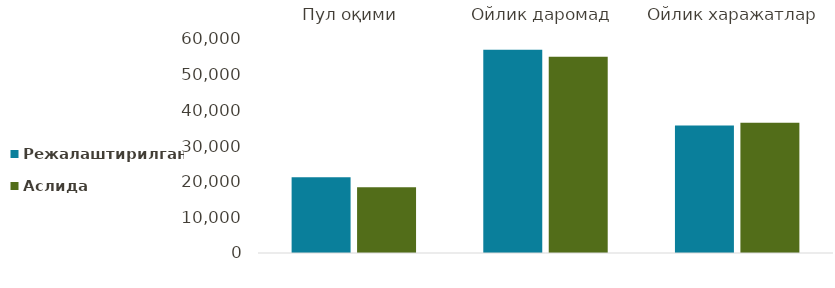
| Category | Режалаштирилган | Аслида |
|---|---|---|
| Пул оқими | 21270 | 18450 |
| Ойлик даромад | 57000 | 55000 |
| Ойлик харажатлар | 35730 | 36550 |